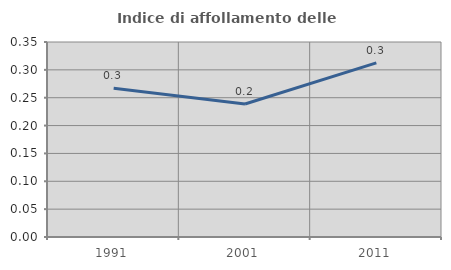
| Category | Indice di affollamento delle abitazioni  |
|---|---|
| 1991.0 | 0.267 |
| 2001.0 | 0.239 |
| 2011.0 | 0.313 |